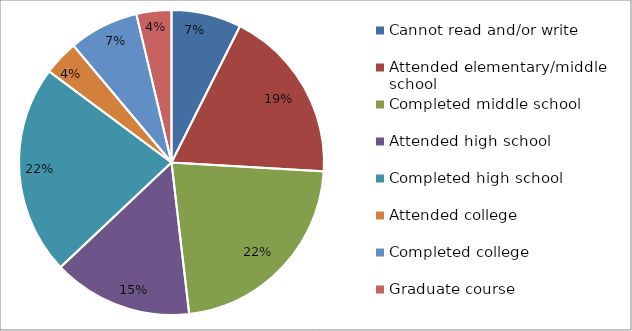
| Category | Series 0 |
|---|---|
| Cannot read and/or write | 2 |
| Attended elementary/middle school | 5 |
| Completed middle school | 6 |
| Attended high school | 4 |
| Completed high school | 6 |
| Attended college | 1 |
| Completed college | 2 |
| Graduate course | 1 |